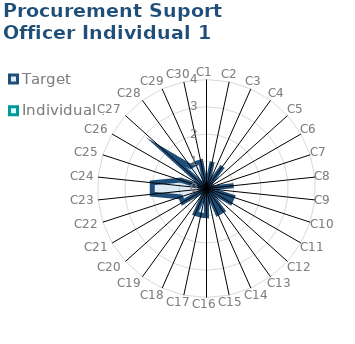
| Category | Target | Individual 1 |
|---|---|---|
| C1 | 0 | 0 |
| C2 | 1 | 0 |
| C3 | 0 | 0 |
| C4 | 1 | 0 |
| C5 | 0 | 0 |
| C6 | 0 | 0 |
| C7 | 0 | 0 |
| C8 | 1 | 0 |
| C9 | 0 | 0 |
| C10 | 1 | 0 |
| C11 | 1 | 0 |
| C12 | 0 | 0 |
| C13 | 1 | 0 |
| C14 | 1 | 0 |
| C15 | 0 | 0 |
| C16 | 1 | 0 |
| C17 | 1 | 0 |
| C18 | 1 | 0 |
| C19 | 0 | 0 |
| C20 | 0 | 0 |
| C21 | 1 | 0 |
| C22 | 1 | 0 |
| C23 | 2 | 0 |
| C24 | 2 | 0 |
| C25 | 1 | 0 |
| C26 | 0 | 0 |
| C27 | 2 | 0 |
| C28 | 1 | 0 |
| C29 | 1 | 0 |
| C30 | 1 | 0 |